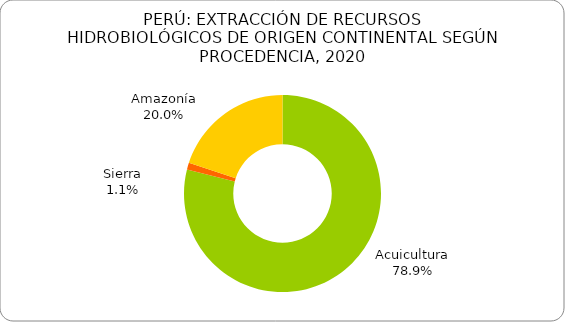
| Category | Series 0 |
|---|---|
| Acuicultura | 0.789 |
| Sierra | 0.011 |
| Amazonía | 0.2 |